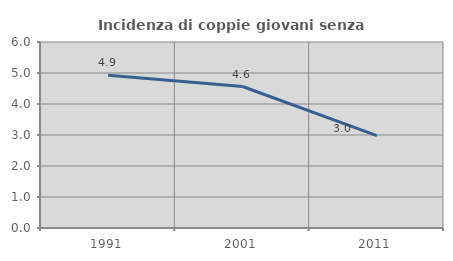
| Category | Incidenza di coppie giovani senza figli |
|---|---|
| 1991.0 | 4.93 |
| 2001.0 | 4.563 |
| 2011.0 | 2.979 |